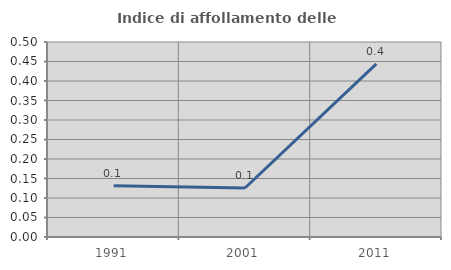
| Category | Indice di affollamento delle abitazioni  |
|---|---|
| 1991.0 | 0.131 |
| 2001.0 | 0.126 |
| 2011.0 | 0.444 |